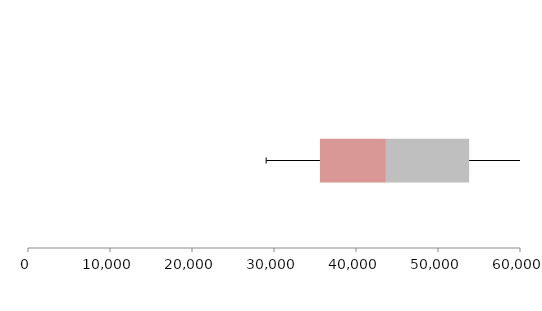
| Category | Series 1 | Series 2 | Series 3 |
|---|---|---|---|
| 0 | 35600.682 | 8047.87 | 10148.191 |